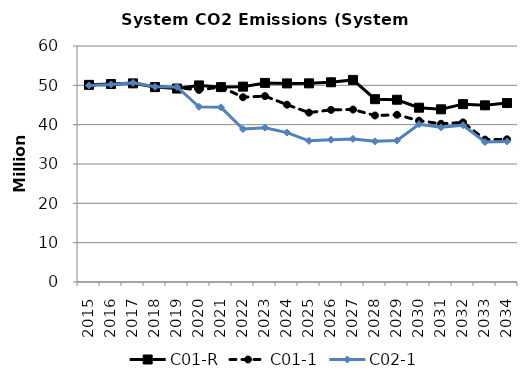
| Category | C01-R | C01-1 | C02-1 |
|---|---|---|---|
| 2015.0 | 50.118 | 49.98 | 49.98 |
| 2016.0 | 50.329 | 50.239 | 50.239 |
| 2017.0 | 50.499 | 50.623 | 50.623 |
| 2018.0 | 49.555 | 49.637 | 49.621 |
| 2019.0 | 49.181 | 49.422 | 49.588 |
| 2020.0 | 49.976 | 48.827 | 44.548 |
| 2021.0 | 49.548 | 49.578 | 44.409 |
| 2022.0 | 49.671 | 46.971 | 38.892 |
| 2023.0 | 50.618 | 47.262 | 39.227 |
| 2024.0 | 50.491 | 45.086 | 37.989 |
| 2025.0 | 50.508 | 43.063 | 35.886 |
| 2026.0 | 50.777 | 43.764 | 36.166 |
| 2027.0 | 51.38 | 43.847 | 36.385 |
| 2028.0 | 46.481 | 42.329 | 35.758 |
| 2029.0 | 46.342 | 42.511 | 35.988 |
| 2030.0 | 44.317 | 41.021 | 40.114 |
| 2031.0 | 43.901 | 40.228 | 39.328 |
| 2032.0 | 45.215 | 40.585 | 39.865 |
| 2033.0 | 44.915 | 36.207 | 35.583 |
| 2034.0 | 45.496 | 36.272 | 35.746 |